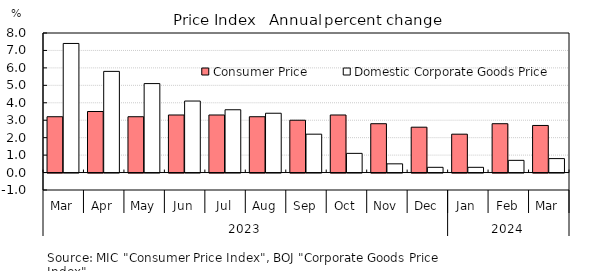
| Category | Consumer Price | Domestic Corporate Goods Price |
|---|---|---|
| 0 | 3.2 | 7.4 |
| 1 | 3.5 | 5.8 |
| 2 | 3.2 | 5.1 |
| 3 | 3.3 | 4.1 |
| 4 | 3.3 | 3.6 |
| 5 | 3.2 | 3.4 |
| 6 | 3 | 2.2 |
| 7 | 3.3 | 1.1 |
| 8 | 2.8 | 0.5 |
| 9 | 2.6 | 0.3 |
| 10 | 2.2 | 0.3 |
| 11 | 2.8 | 0.7 |
| 12 | 2.7 | 0.8 |